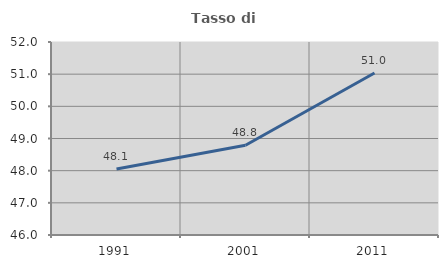
| Category | Tasso di occupazione   |
|---|---|
| 1991.0 | 48.051 |
| 2001.0 | 48.791 |
| 2011.0 | 51.035 |